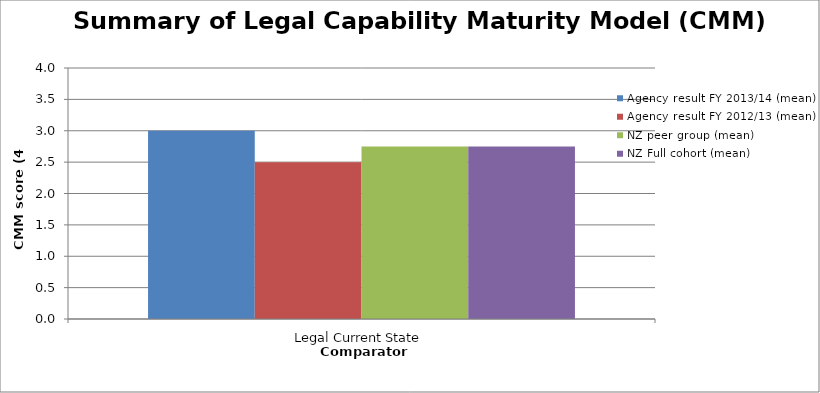
| Category | Agency result FY 2013/14 (mean) | Agency result FY 2012/13 (mean) | NZ peer group (mean) | NZ Full cohort (mean) |
|---|---|---|---|---|
| Legal Current State | 3 | 2.5 | 2.75 | 2.75 |